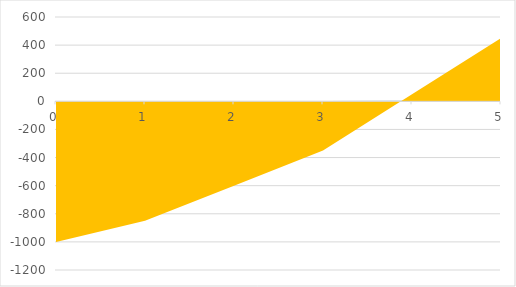
| Category | Series 0 | Series 1 |
|---|---|---|
| 0.0 | 0 | -1000 |
| 1.0 | 1 | -850 |
| 2.0 | 2 | -600 |
| 3.0 | 3 | -350 |
| 4.0 | 4 | 50 |
| 5.0 | 5 | 450 |